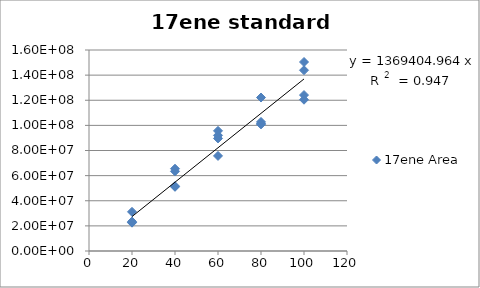
| Category | 17ene Area |
|---|---|
| 100.0 | 143912335 |
| 100.0 | 120434972 |
| 100.0 | 150447750 |
| 100.0 | 124141477 |
| 80.0 | 122164769 |
| 80.0 | 102729485 |
| 80.0 | 100785820 |
| 80.0 | 101458845 |
| 60.0 | 89612645 |
| 60.0 | 75687697 |
| 60.0 | 92053171 |
| 60.0 | 95635612 |
| 40.0 | 51085763 |
| 40.0 | 65491244 |
| 40.0 | 63453063 |
| 40.0 | 51648826 |
| 20.0 | 31180404 |
| 20.0 | 23429471 |
| 20.0 | 22637501 |
| 20.0 | 22570954 |